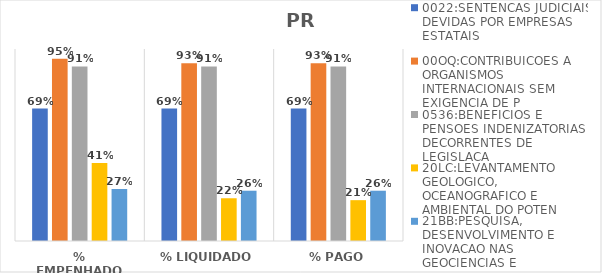
| Category | 0022:SENTENCAS JUDICIAIS DEVIDAS POR EMPRESAS ESTATAIS | 00OQ:CONTRIBUICOES A ORGANISMOS INTERNACIONAIS SEM EXIGENCIA DE P | 0536:BENEFICIOS E PENSOES INDENIZATORIAS DECORRENTES DE LEGISLACA | 20LC:LEVANTAMENTO GEOLOGICO, OCEANOGRAFICO E AMBIENTAL DO POTEN | 21BB:PESQUISA, DESENVOLVIMENTO E INOVACAO NAS GEOCIENCIAS E |
|---|---|---|---|---|---|
| % EMPENHADO | 0.689 | 0.95 | 0.909 | 0.406 | 0.271 |
| % LIQUIDADO | 0.689 | 0.926 | 0.909 | 0.223 | 0.262 |
| % PAGO | 0.689 | 0.926 | 0.909 | 0.213 | 0.262 |